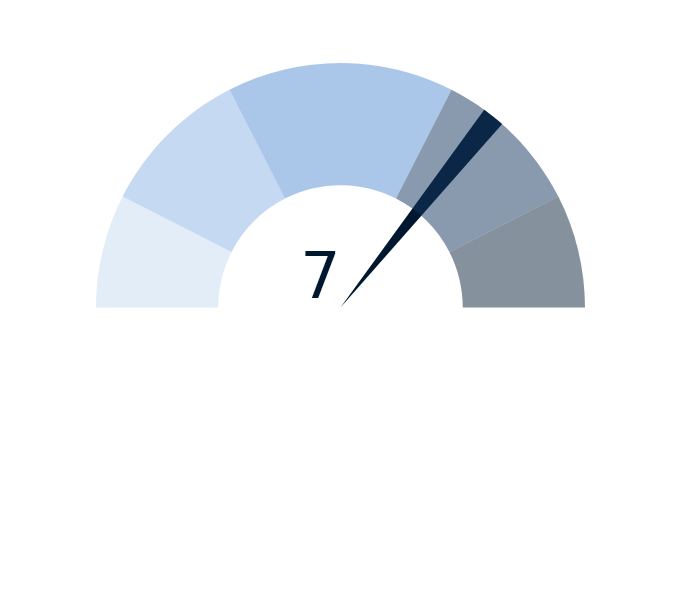
| Category | factor |
|---|---|
| 0 | 7 |
| 1 | 0.3 |
| 2 | 12.7 |